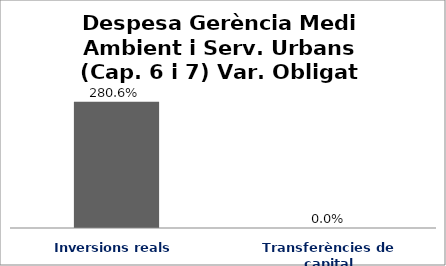
| Category | Series 0 |
|---|---|
| Inversions reals | 2.806 |
| Transferències de capital | 0 |